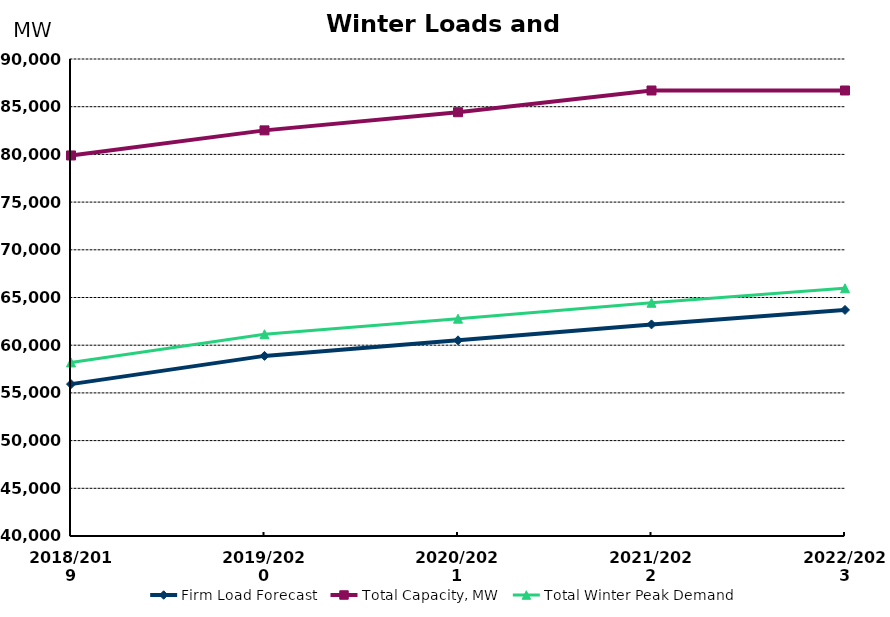
| Category | Firm Load Forecast | Total Capacity, MW | Total Winter Peak Demand |
|---|---|---|---|
| 2018/2019 | 55920.941 | 79888.914 | 58196.072 |
| 2019/2020 | 58879.64 | 82518.898 | 61149.762 |
| 2020/2021 | 60512.165 | 84420.146 | 62782.287 |
| 2021/2022 | 62178.403 | 86699.666 | 64448.525 |
| 2022/2023 | 63696.836 | 86699.666 | 65966.958 |